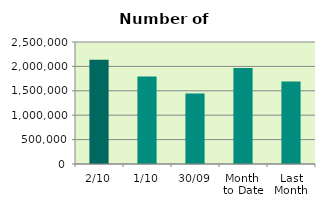
| Category | Series 0 |
|---|---|
| 2/10 | 2135530 |
| 1/10 | 1794794 |
| 30/09 | 1446688 |
| Month 
to Date | 1965162 |
| Last
Month | 1689477.048 |